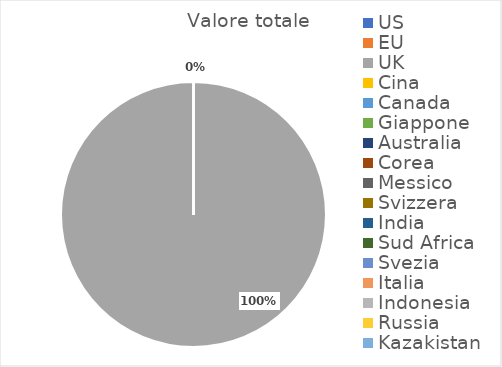
| Category | Valore totale |
|---|---|
| US | 0 |
| EU | 0 |
| UK | 3827.55 |
| Cina | 0 |
| Canada | 0 |
| Giappone | 0 |
| Australia | 0 |
| Corea | 0 |
| Messico | 0 |
| Svizzera | 0 |
| India | 0 |
| Sud Africa | 0 |
| Svezia | 0 |
| Italia | 0 |
| Indonesia | 0 |
| Russia | 0 |
| Kazakistan | 0 |